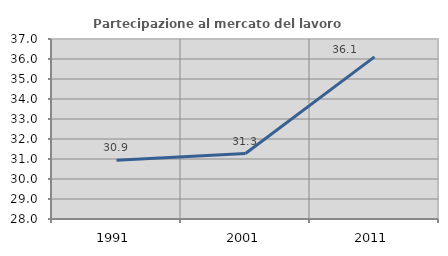
| Category | Partecipazione al mercato del lavoro  femminile |
|---|---|
| 1991.0 | 30.94 |
| 2001.0 | 31.271 |
| 2011.0 | 36.105 |